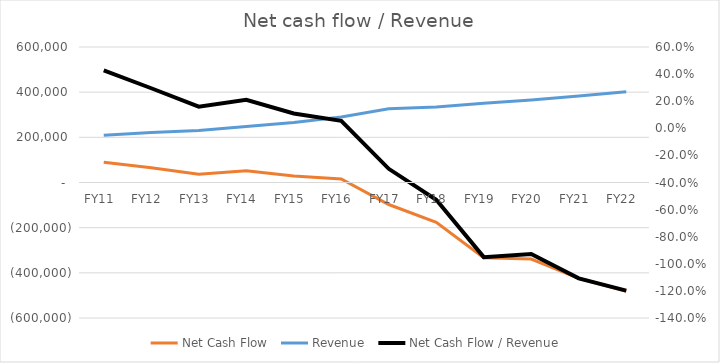
| Category | Net Cash Flow | Revenue |
|---|---|---|
| FY11  | 89667.685 | 209591.43 |
| FY12  | 65319.501 | 220985.743 |
| FY13  | 36770.354 | 230429.261 |
| FY14  | 52217.951 | 247989.841 |
| FY15  | 29165.406 | 265855.45 |
| FY16  | 15942.695 | 290471.114 |
| FY17  | -97514.496 | 326213.149 |
| FY18  | -176372.397 | 334356.494 |
| FY19  | -333274.902 | 350536.807 |
| FY20  | -338749.355 | 365276.666 |
| FY21  | -423795.222 | 382692.168 |
| FY22  | -481422.513 | 401785.618 |